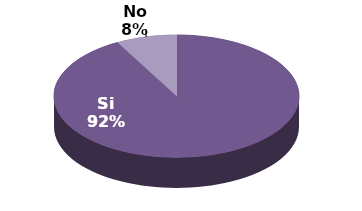
| Category | Series 1 |
|---|---|
| Si | 184 |
| No | 16 |